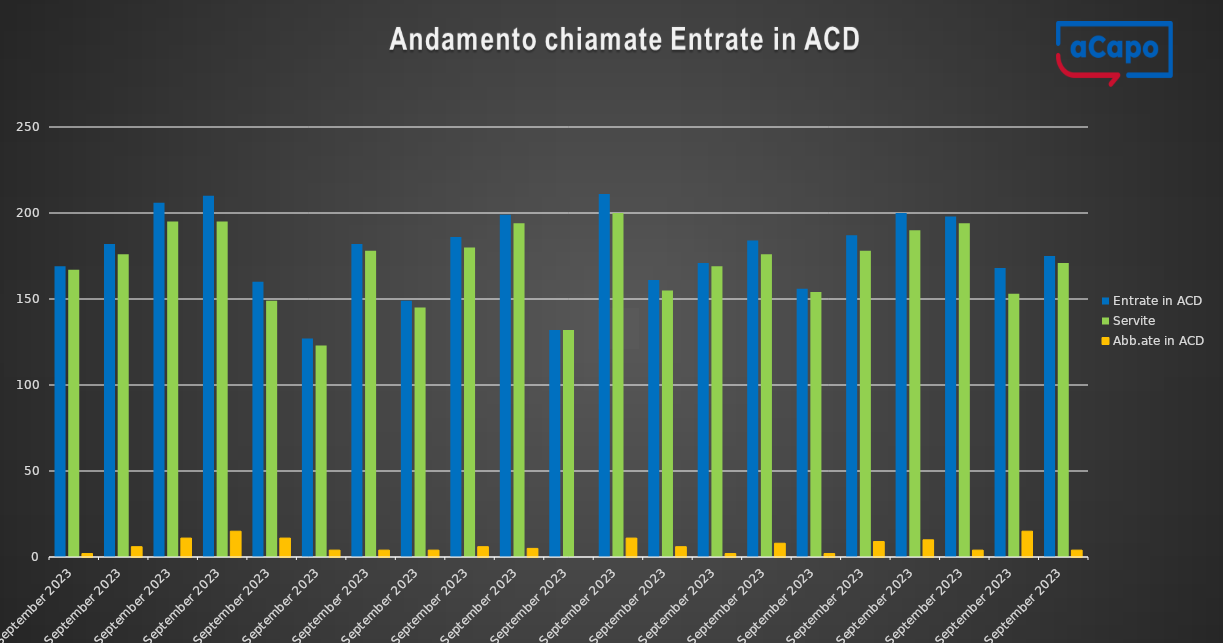
| Category | Entrate in ACD | Servite | Abb.ate in ACD |
|---|---|---|---|
| 2023-09-01 | 169 | 167 | 2 |
| 2023-09-04 | 182 | 176 | 6 |
| 2023-09-05 | 206 | 195 | 11 |
| 2023-09-06 | 210 | 195 | 15 |
| 2023-09-07 | 160 | 149 | 11 |
| 2023-09-08 | 127 | 123 | 4 |
| 2023-09-11 | 182 | 178 | 4 |
| 2023-09-12 | 149 | 145 | 4 |
| 2023-09-13 | 186 | 180 | 6 |
| 2023-09-14 | 199 | 194 | 5 |
| 2023-09-15 | 132 | 132 | 0 |
| 2023-09-18 | 211 | 200 | 11 |
| 2023-09-19 | 161 | 155 | 6 |
| 2023-09-20 | 171 | 169 | 2 |
| 2023-09-21 | 184 | 176 | 8 |
| 2023-09-22 | 156 | 154 | 2 |
| 2023-09-25 | 187 | 178 | 9 |
| 2023-09-26 | 200 | 190 | 10 |
| 2023-09-27 | 198 | 194 | 4 |
| 2023-09-28 | 168 | 153 | 15 |
| 2023-09-29 | 175 | 171 | 4 |